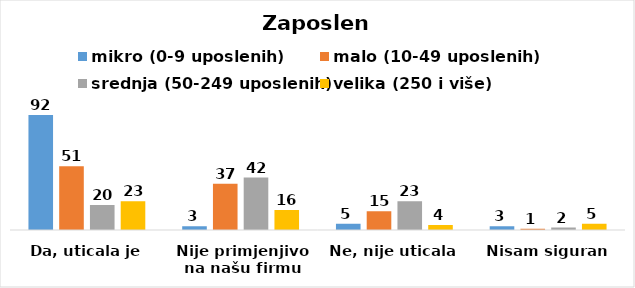
| Category | mikro (0-9 uposlenih) | malo (10-49 uposlenih) | srednja (50-249 uposlenih) | velika (250 i više) |
|---|---|---|---|---|
| Da, uticala je | 92 | 51 | 20 | 23 |
| Nije primjenjivo na našu firmu | 3 | 37 | 42 | 16 |
| Ne, nije uticala | 5 | 15 | 23 | 4 |
| Nisam siguran | 3 | 1 | 2 | 5 |